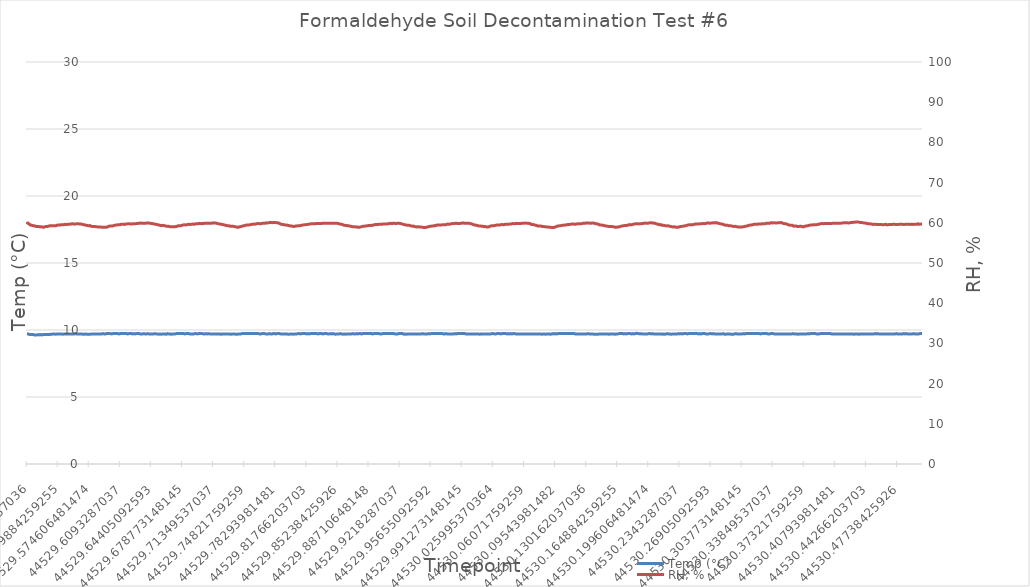
| Category | Temp (°C) |
|---|---|
| 44529.505162037036 | 9.731 |
| 44529.50585648148 | 9.706 |
| 44529.50655092592 | 9.706 |
| 44529.50724537037 | 9.682 |
| 44529.507939814815 | 9.657 |
| 44529.508634259255 | 9.657 |
| 44529.5093287037 | 9.657 |
| 44529.51002314815 | 9.657 |
| 44529.51071759259 | 9.657 |
| 44529.511412037034 | 9.657 |
| 44529.51210648148 | 9.657 |
| 44529.51280092592 | 9.657 |
| 44529.51349537037 | 9.632 |
| 44529.514189814814 | 9.657 |
| 44529.51488425925 | 9.632 |
| 44529.5155787037 | 9.657 |
| 44529.51627314815 | 9.632 |
| 44529.51696759259 | 9.657 |
| 44529.51766203703 | 9.657 |
| 44529.51835648148 | 9.657 |
| 44529.51905092593 | 9.632 |
| 44529.519745370366 | 9.632 |
| 44529.52043981481 | 9.657 |
| 44529.52113425926 | 9.632 |
| 44529.5218287037 | 9.632 |
| 44529.522523148145 | 9.682 |
| 44529.52321759259 | 9.657 |
| 44529.52391203703 | 9.657 |
| 44529.52460648148 | 9.657 |
| 44529.525300925925 | 9.657 |
| 44529.525995370364 | 9.657 |
| 44529.52668981481 | 9.682 |
| 44529.52738425926 | 9.657 |
| 44529.528078703705 | 9.657 |
| 44529.528773148144 | 9.657 |
| 44529.52946759259 | 9.682 |
| 44529.53016203704 | 9.657 |
| 44529.53085648148 | 9.682 |
| 44529.53155092592 | 9.682 |
| 44529.53224537037 | 9.682 |
| 44529.53293981481 | 9.682 |
| 44529.533634259256 | 9.706 |
| 44529.5343287037 | 9.706 |
| 44529.53502314814 | 9.706 |
| 44529.53571759259 | 9.706 |
| 44529.536412037036 | 9.682 |
| 44529.53710648148 | 9.682 |
| 44529.53780092592 | 9.682 |
| 44529.53849537037 | 9.706 |
| 44529.539189814815 | 9.706 |
| 44529.539884259255 | 9.706 |
| 44529.5405787037 | 9.706 |
| 44529.54127314815 | 9.706 |
| 44529.54196759259 | 9.706 |
| 44529.542662037034 | 9.706 |
| 44529.543356481474 | 9.706 |
| 44529.54405092592 | 9.706 |
| 44529.54474537037 | 9.706 |
| 44529.54543981481 | 9.682 |
| 44529.54613425925 | 9.706 |
| 44529.5468287037 | 9.706 |
| 44529.54752314815 | 9.706 |
| 44529.548217592586 | 9.706 |
| 44529.54891203703 | 9.706 |
| 44529.54960648148 | 9.706 |
| 44529.55030092592 | 9.706 |
| 44529.550995370366 | 9.706 |
| 44529.55168981481 | 9.706 |
| 44529.55238425925 | 9.706 |
| 44529.5530787037 | 9.682 |
| 44529.553773148145 | 9.706 |
| 44529.554467592585 | 9.706 |
| 44529.55516203703 | 9.706 |
| 44529.55585648148 | 9.706 |
| 44529.55655092592 | 9.706 |
| 44529.557245370364 | 9.706 |
| 44529.55793981481 | 9.706 |
| 44529.55863425926 | 9.706 |
| 44529.5593287037 | 9.731 |
| 44529.560023148144 | 9.706 |
| 44529.56071759259 | 9.706 |
| 44529.56141203703 | 9.706 |
| 44529.56210648148 | 9.706 |
| 44529.56280092592 | 9.706 |
| 44529.56349537036 | 9.706 |
| 44529.56418981481 | 9.706 |
| 44529.564884259256 | 9.706 |
| 44529.565578703696 | 9.706 |
| 44529.56627314814 | 9.706 |
| 44529.56696759259 | 9.706 |
| 44529.56766203703 | 9.682 |
| 44529.568356481475 | 9.706 |
| 44529.56905092592 | 9.682 |
| 44529.56974537037 | 9.682 |
| 44529.57043981481 | 9.706 |
| 44529.571134259255 | 9.682 |
| 44529.5718287037 | 9.682 |
| 44529.57252314814 | 9.682 |
| 44529.57321759259 | 9.682 |
| 44529.573912037034 | 9.682 |
| 44529.574606481474 | 9.682 |
| 44529.57530092592 | 9.706 |
| 44529.57599537037 | 9.682 |
| 44529.57668981481 | 9.682 |
| 44529.57738425925 | 9.706 |
| 44529.5780787037 | 9.706 |
| 44529.57877314815 | 9.706 |
| 44529.579467592586 | 9.682 |
| 44529.58016203703 | 9.706 |
| 44529.58085648148 | 9.706 |
| 44529.58155092592 | 9.706 |
| 44529.582245370366 | 9.706 |
| 44529.58293981481 | 9.706 |
| 44529.58363425926 | 9.706 |
| 44529.584328703706 | 9.706 |
| 44529.585023148145 | 9.706 |
| 44529.58571759259 | 9.706 |
| 44529.58641203704 | 9.706 |
| 44529.58710648148 | 9.706 |
| 44529.587800925925 | 9.682 |
| 44529.58849537037 | 9.706 |
| 44529.58918981482 | 9.731 |
| 44529.58988425926 | 9.731 |
| 44529.590578703705 | 9.706 |
| 44529.59127314815 | 9.706 |
| 44529.59196759259 | 9.731 |
| 44529.59266203704 | 9.706 |
| 44529.593356481484 | 9.731 |
| 44529.59405092592 | 9.731 |
| 44529.59474537037 | 9.731 |
| 44529.59543981482 | 9.731 |
| 44529.596134259256 | 9.731 |
| 44529.5968287037 | 9.731 |
| 44529.59752314815 | 9.731 |
| 44529.59821759259 | 9.731 |
| 44529.598912037036 | 9.706 |
| 44529.59960648148 | 9.706 |
| 44529.60030092593 | 9.706 |
| 44529.60099537037 | 9.731 |
| 44529.601689814815 | 9.706 |
| 44529.60238425926 | 9.731 |
| 44529.6030787037 | 9.731 |
| 44529.60377314815 | 9.731 |
| 44529.604467592595 | 9.731 |
| 44529.605162037034 | 9.731 |
| 44529.60585648148 | 9.731 |
| 44529.60655092593 | 9.731 |
| 44529.60724537037 | 9.731 |
| 44529.607939814814 | 9.706 |
| 44529.60863425926 | 9.731 |
| 44529.6093287037 | 9.731 |
| 44529.61002314815 | 9.706 |
| 44529.61071759259 | 9.731 |
| 44529.61141203704 | 9.731 |
| 44529.61210648148 | 9.731 |
| 44529.61280092593 | 9.731 |
| 44529.61349537037 | 9.731 |
| 44529.61418981481 | 9.731 |
| 44529.61488425926 | 9.731 |
| 44529.615578703706 | 9.731 |
| 44529.616273148145 | 9.731 |
| 44529.61696759259 | 9.706 |
| 44529.61766203704 | 9.706 |
| 44529.61835648148 | 9.731 |
| 44529.619050925925 | 9.731 |
| 44529.61974537037 | 9.731 |
| 44529.62043981482 | 9.731 |
| 44529.62113425926 | 9.731 |
| 44529.621828703705 | 9.731 |
| 44529.62252314815 | 9.706 |
| 44529.62321759259 | 9.706 |
| 44529.62391203704 | 9.731 |
| 44529.624606481484 | 9.731 |
| 44529.62530092592 | 9.706 |
| 44529.62599537037 | 9.706 |
| 44529.62668981481 | 9.706 |
| 44529.627384259256 | 9.731 |
| 44529.6280787037 | 9.731 |
| 44529.62877314814 | 9.731 |
| 44529.62946759259 | 9.731 |
| 44529.630162037036 | 9.731 |
| 44529.63085648148 | 9.731 |
| 44529.63155092592 | 9.706 |
| 44529.63224537037 | 9.731 |
| 44529.632939814815 | 9.706 |
| 44529.633634259255 | 9.706 |
| 44529.6343287037 | 9.706 |
| 44529.63502314815 | 9.706 |
| 44529.63571759259 | 9.731 |
| 44529.636412037034 | 9.731 |
| 44529.63710648148 | 9.706 |
| 44529.63780092592 | 9.706 |
| 44529.63849537037 | 9.706 |
| 44529.639189814814 | 9.706 |
| 44529.63988425925 | 9.731 |
| 44529.6405787037 | 9.706 |
| 44529.64127314815 | 9.706 |
| 44529.64196759259 | 9.706 |
| 44529.64266203703 | 9.706 |
| 44529.64335648148 | 9.706 |
| 44529.64405092593 | 9.706 |
| 44529.644745370366 | 9.706 |
| 44529.64543981481 | 9.706 |
| 44529.64613425926 | 9.706 |
| 44529.6468287037 | 9.706 |
| 44529.647523148145 | 9.706 |
| 44529.64821759259 | 9.731 |
| 44529.64891203703 | 9.706 |
| 44529.64960648148 | 9.706 |
| 44529.650300925925 | 9.706 |
| 44529.650995370364 | 9.706 |
| 44529.65168981481 | 9.706 |
| 44529.65238425926 | 9.682 |
| 44529.653078703705 | 9.706 |
| 44529.653773148144 | 9.706 |
| 44529.65446759259 | 9.682 |
| 44529.65516203704 | 9.682 |
| 44529.65585648148 | 9.682 |
| 44529.65655092592 | 9.706 |
| 44529.65724537037 | 9.706 |
| 44529.65793981481 | 9.706 |
| 44529.658634259256 | 9.706 |
| 44529.6593287037 | 9.706 |
| 44529.66002314814 | 9.706 |
| 44529.66071759259 | 9.682 |
| 44529.661412037036 | 9.706 |
| 44529.66210648148 | 9.731 |
| 44529.66280092592 | 9.706 |
| 44529.66349537037 | 9.706 |
| 44529.664189814815 | 9.706 |
| 44529.664884259255 | 9.706 |
| 44529.6655787037 | 9.706 |
| 44529.66627314815 | 9.682 |
| 44529.66696759259 | 9.706 |
| 44529.667662037034 | 9.706 |
| 44529.668356481474 | 9.706 |
| 44529.66905092592 | 9.706 |
| 44529.66974537037 | 9.706 |
| 44529.67043981481 | 9.706 |
| 44529.67113425925 | 9.731 |
| 44529.6718287037 | 9.731 |
| 44529.67252314815 | 9.731 |
| 44529.673217592586 | 9.731 |
| 44529.67391203703 | 9.731 |
| 44529.67460648148 | 9.731 |
| 44529.67530092592 | 9.731 |
| 44529.675995370366 | 9.731 |
| 44529.67668981481 | 9.706 |
| 44529.67738425925 | 9.731 |
| 44529.6780787037 | 9.731 |
| 44529.678773148145 | 9.731 |
| 44529.679467592585 | 9.706 |
| 44529.68016203703 | 9.731 |
| 44529.68085648148 | 9.731 |
| 44529.68155092592 | 9.706 |
| 44529.682245370364 | 9.706 |
| 44529.68293981481 | 9.731 |
| 44529.68363425926 | 9.731 |
| 44529.6843287037 | 9.731 |
| 44529.685023148144 | 9.731 |
| 44529.68571759259 | 9.731 |
| 44529.68641203703 | 9.731 |
| 44529.68710648148 | 9.706 |
| 44529.68780092592 | 9.731 |
| 44529.68849537036 | 9.706 |
| 44529.68918981481 | 9.731 |
| 44529.689884259256 | 9.706 |
| 44529.690578703696 | 9.731 |
| 44529.69127314814 | 9.706 |
| 44529.69196759259 | 9.731 |
| 44529.69266203703 | 9.731 |
| 44529.693356481475 | 9.731 |
| 44529.69405092592 | 9.731 |
| 44529.69474537037 | 9.731 |
| 44529.69543981481 | 9.706 |
| 44529.696134259255 | 9.706 |
| 44529.6968287037 | 9.731 |
| 44529.69752314814 | 9.731 |
| 44529.69821759259 | 9.731 |
| 44529.698912037034 | 9.731 |
| 44529.699606481474 | 9.731 |
| 44529.70030092592 | 9.706 |
| 44529.70099537037 | 9.731 |
| 44529.70168981481 | 9.706 |
| 44529.70238425925 | 9.706 |
| 44529.7030787037 | 9.731 |
| 44529.70377314815 | 9.706 |
| 44529.704467592586 | 9.731 |
| 44529.70516203703 | 9.731 |
| 44529.70585648148 | 9.706 |
| 44529.70655092592 | 9.706 |
| 44529.707245370366 | 9.731 |
| 44529.70793981481 | 9.731 |
| 44529.70863425926 | 9.706 |
| 44529.709328703706 | 9.706 |
| 44529.710023148145 | 9.731 |
| 44529.71071759259 | 9.706 |
| 44529.71141203704 | 9.706 |
| 44529.71210648148 | 9.706 |
| 44529.712800925925 | 9.731 |
| 44529.71349537037 | 9.706 |
| 44529.71418981482 | 9.706 |
| 44529.71488425926 | 9.706 |
| 44529.715578703705 | 9.706 |
| 44529.71627314815 | 9.706 |
| 44529.71696759259 | 9.706 |
| 44529.71766203704 | 9.706 |
| 44529.718356481484 | 9.706 |
| 44529.71905092592 | 9.706 |
| 44529.71974537037 | 9.706 |
| 44529.72043981482 | 9.706 |
| 44529.721134259256 | 9.682 |
| 44529.7218287037 | 9.682 |
| 44529.72252314815 | 9.706 |
| 44529.72321759259 | 9.706 |
| 44529.723912037036 | 9.706 |
| 44529.72460648148 | 9.706 |
| 44529.72530092593 | 9.706 |
| 44529.72599537037 | 9.706 |
| 44529.726689814815 | 9.706 |
| 44529.72738425926 | 9.706 |
| 44529.7280787037 | 9.706 |
| 44529.72877314815 | 9.706 |
| 44529.729467592595 | 9.682 |
| 44529.730162037034 | 9.706 |
| 44529.73085648148 | 9.682 |
| 44529.73155092593 | 9.706 |
| 44529.73224537037 | 9.682 |
| 44529.732939814814 | 9.682 |
| 44529.73363425926 | 9.706 |
| 44529.7343287037 | 9.706 |
| 44529.73502314815 | 9.706 |
| 44529.73571759259 | 9.706 |
| 44529.73641203704 | 9.706 |
| 44529.73710648148 | 9.706 |
| 44529.73780092593 | 9.706 |
| 44529.73849537037 | 9.682 |
| 44529.73918981481 | 9.706 |
| 44529.73988425926 | 9.682 |
| 44529.740578703706 | 9.682 |
| 44529.741273148145 | 9.706 |
| 44529.74196759259 | 9.706 |
| 44529.74266203704 | 9.706 |
| 44529.74335648148 | 9.731 |
| 44529.744050925925 | 9.706 |
| 44529.74474537037 | 9.706 |
| 44529.74543981482 | 9.731 |
| 44529.74613425926 | 9.731 |
| 44529.746828703705 | 9.731 |
| 44529.74752314815 | 9.731 |
| 44529.74821759259 | 9.731 |
| 44529.74891203704 | 9.731 |
| 44529.749606481484 | 9.731 |
| 44529.75030092592 | 9.731 |
| 44529.75099537037 | 9.731 |
| 44529.75168981481 | 9.731 |
| 44529.752384259256 | 9.731 |
| 44529.7530787037 | 9.731 |
| 44529.75377314814 | 9.731 |
| 44529.75446759259 | 9.731 |
| 44529.755162037036 | 9.731 |
| 44529.75585648148 | 9.731 |
| 44529.75655092592 | 9.731 |
| 44529.75724537037 | 9.731 |
| 44529.757939814815 | 9.731 |
| 44529.758634259255 | 9.731 |
| 44529.7593287037 | 9.731 |
| 44529.76002314815 | 9.731 |
| 44529.76071759259 | 9.731 |
| 44529.761412037034 | 9.706 |
| 44529.76210648148 | 9.731 |
| 44529.76280092592 | 9.731 |
| 44529.76349537037 | 9.731 |
| 44529.764189814814 | 9.731 |
| 44529.76488425925 | 9.706 |
| 44529.7655787037 | 9.706 |
| 44529.76627314815 | 9.706 |
| 44529.76696759259 | 9.731 |
| 44529.76766203703 | 9.731 |
| 44529.76835648148 | 9.731 |
| 44529.76905092593 | 9.731 |
| 44529.769745370366 | 9.731 |
| 44529.77043981481 | 9.731 |
| 44529.77113425926 | 9.731 |
| 44529.7718287037 | 9.706 |
| 44529.772523148145 | 9.706 |
| 44529.77321759259 | 9.706 |
| 44529.77391203703 | 9.706 |
| 44529.77460648148 | 9.706 |
| 44529.775300925925 | 9.731 |
| 44529.775995370364 | 9.731 |
| 44529.77668981481 | 9.731 |
| 44529.77738425926 | 9.706 |
| 44529.778078703705 | 9.731 |
| 44529.778773148144 | 9.706 |
| 44529.77946759259 | 9.731 |
| 44529.78016203704 | 9.731 |
| 44529.78085648148 | 9.706 |
| 44529.78155092592 | 9.731 |
| 44529.78224537037 | 9.731 |
| 44529.78293981481 | 9.706 |
| 44529.783634259256 | 9.731 |
| 44529.7843287037 | 9.731 |
| 44529.78502314814 | 9.731 |
| 44529.78571759259 | 9.731 |
| 44529.786412037036 | 9.706 |
| 44529.78710648148 | 9.731 |
| 44529.78780092592 | 9.706 |
| 44529.78849537037 | 9.706 |
| 44529.789189814815 | 9.706 |
| 44529.789884259255 | 9.706 |
| 44529.7905787037 | 9.706 |
| 44529.79127314815 | 9.706 |
| 44529.79196759259 | 9.706 |
| 44529.792662037034 | 9.706 |
| 44529.793356481474 | 9.706 |
| 44529.79405092592 | 9.706 |
| 44529.79474537037 | 9.682 |
| 44529.79543981481 | 9.706 |
| 44529.79613425925 | 9.682 |
| 44529.7968287037 | 9.682 |
| 44529.79752314815 | 9.706 |
| 44529.798217592586 | 9.682 |
| 44529.79891203703 | 9.706 |
| 44529.79960648148 | 9.706 |
| 44529.80030092592 | 9.706 |
| 44529.800995370366 | 9.706 |
| 44529.80168981481 | 9.682 |
| 44529.80238425925 | 9.682 |
| 44529.8030787037 | 9.682 |
| 44529.803773148145 | 9.706 |
| 44529.804467592585 | 9.706 |
| 44529.80516203703 | 9.706 |
| 44529.80585648148 | 9.706 |
| 44529.80655092592 | 9.706 |
| 44529.807245370364 | 9.706 |
| 44529.80793981481 | 9.731 |
| 44529.80863425926 | 9.706 |
| 44529.8093287037 | 9.731 |
| 44529.810023148144 | 9.706 |
| 44529.81071759259 | 9.706 |
| 44529.81141203703 | 9.731 |
| 44529.81210648148 | 9.731 |
| 44529.81280092592 | 9.731 |
| 44529.81349537036 | 9.731 |
| 44529.81418981481 | 9.706 |
| 44529.814884259256 | 9.731 |
| 44529.815578703696 | 9.731 |
| 44529.81627314814 | 9.731 |
| 44529.81696759259 | 9.706 |
| 44529.81766203703 | 9.706 |
| 44529.818356481475 | 9.731 |
| 44529.81905092592 | 9.731 |
| 44529.81974537037 | 9.731 |
| 44529.82043981481 | 9.706 |
| 44529.821134259255 | 9.731 |
| 44529.8218287037 | 9.731 |
| 44529.82252314814 | 9.706 |
| 44529.82321759259 | 9.731 |
| 44529.823912037034 | 9.731 |
| 44529.824606481474 | 9.731 |
| 44529.82530092592 | 9.731 |
| 44529.82599537037 | 9.731 |
| 44529.82668981481 | 9.731 |
| 44529.82738425925 | 9.731 |
| 44529.8280787037 | 9.731 |
| 44529.82877314815 | 9.731 |
| 44529.829467592586 | 9.731 |
| 44529.83016203703 | 9.706 |
| 44529.83085648148 | 9.731 |
| 44529.83155092592 | 9.731 |
| 44529.832245370366 | 9.731 |
| 44529.83293981481 | 9.731 |
| 44529.83363425926 | 9.731 |
| 44529.834328703706 | 9.731 |
| 44529.835023148145 | 9.731 |
| 44529.83571759259 | 9.706 |
| 44529.83641203704 | 9.731 |
| 44529.83710648148 | 9.731 |
| 44529.837800925925 | 9.731 |
| 44529.83849537037 | 9.731 |
| 44529.83918981482 | 9.706 |
| 44529.83988425926 | 9.731 |
| 44529.840578703705 | 9.731 |
| 44529.84127314815 | 9.706 |
| 44529.84196759259 | 9.706 |
| 44529.84266203704 | 9.706 |
| 44529.843356481484 | 9.731 |
| 44529.84405092592 | 9.731 |
| 44529.84474537037 | 9.706 |
| 44529.84543981482 | 9.706 |
| 44529.846134259256 | 9.706 |
| 44529.8468287037 | 9.731 |
| 44529.84752314815 | 9.706 |
| 44529.84821759259 | 9.706 |
| 44529.848912037036 | 9.706 |
| 44529.84960648148 | 9.682 |
| 44529.85030092593 | 9.706 |
| 44529.85099537037 | 9.706 |
| 44529.851689814815 | 9.706 |
| 44529.85238425926 | 9.706 |
| 44529.8530787037 | 9.706 |
| 44529.85377314815 | 9.706 |
| 44529.854467592595 | 9.706 |
| 44529.855162037034 | 9.731 |
| 44529.85585648148 | 9.706 |
| 44529.85655092593 | 9.706 |
| 44529.85724537037 | 9.706 |
| 44529.857939814814 | 9.682 |
| 44529.85863425926 | 9.682 |
| 44529.8593287037 | 9.706 |
| 44529.86002314815 | 9.682 |
| 44529.86071759259 | 9.682 |
| 44529.86141203704 | 9.706 |
| 44529.86210648148 | 9.706 |
| 44529.86280092593 | 9.731 |
| 44529.86349537037 | 9.706 |
| 44529.86418981481 | 9.706 |
| 44529.86488425926 | 9.706 |
| 44529.865578703706 | 9.706 |
| 44529.866273148145 | 9.706 |
| 44529.86696759259 | 9.731 |
| 44529.86766203704 | 9.706 |
| 44529.86835648148 | 9.706 |
| 44529.869050925925 | 9.731 |
| 44529.86974537037 | 9.706 |
| 44529.87043981482 | 9.706 |
| 44529.87113425926 | 9.706 |
| 44529.871828703705 | 9.706 |
| 44529.87252314815 | 9.706 |
| 44529.87321759259 | 9.731 |
| 44529.87391203704 | 9.706 |
| 44529.874606481484 | 9.706 |
| 44529.87530092592 | 9.706 |
| 44529.87599537037 | 9.731 |
| 44529.87668981481 | 9.706 |
| 44529.877384259256 | 9.731 |
| 44529.8780787037 | 9.731 |
| 44529.87877314814 | 9.706 |
| 44529.87946759259 | 9.731 |
| 44529.880162037036 | 9.731 |
| 44529.88085648148 | 9.731 |
| 44529.88155092592 | 9.731 |
| 44529.88224537037 | 9.731 |
| 44529.882939814815 | 9.731 |
| 44529.883634259255 | 9.731 |
| 44529.8843287037 | 9.731 |
| 44529.88502314815 | 9.756 |
| 44529.88571759259 | 9.731 |
| 44529.886412037034 | 9.731 |
| 44529.88710648148 | 9.731 |
| 44529.88780092592 | 9.731 |
| 44529.88849537037 | 9.731 |
| 44529.889189814814 | 9.706 |
| 44529.88988425925 | 9.731 |
| 44529.8905787037 | 9.731 |
| 44529.89127314815 | 9.706 |
| 44529.89196759259 | 9.706 |
| 44529.89266203703 | 9.731 |
| 44529.89335648148 | 9.731 |
| 44529.89405092593 | 9.731 |
| 44529.894745370366 | 9.731 |
| 44529.89543981481 | 9.731 |
| 44529.89613425926 | 9.731 |
| 44529.8968287037 | 9.731 |
| 44529.897523148145 | 9.706 |
| 44529.89821759259 | 9.731 |
| 44529.89891203703 | 9.731 |
| 44529.89960648148 | 9.706 |
| 44529.900300925925 | 9.731 |
| 44529.900995370364 | 9.706 |
| 44529.90168981481 | 9.731 |
| 44529.90238425926 | 9.731 |
| 44529.903078703705 | 9.756 |
| 44529.903773148144 | 9.731 |
| 44529.90446759259 | 9.731 |
| 44529.90516203704 | 9.731 |
| 44529.90585648148 | 9.731 |
| 44529.90655092592 | 9.731 |
| 44529.90724537037 | 9.731 |
| 44529.90793981481 | 9.731 |
| 44529.908634259256 | 9.731 |
| 44529.9093287037 | 9.731 |
| 44529.91002314814 | 9.706 |
| 44529.91071759259 | 9.731 |
| 44529.911412037036 | 9.731 |
| 44529.91210648148 | 9.731 |
| 44529.91280092592 | 9.731 |
| 44529.91349537037 | 9.731 |
| 44529.914189814815 | 9.731 |
| 44529.914884259255 | 9.731 |
| 44529.9155787037 | 9.731 |
| 44529.91627314815 | 9.706 |
| 44529.91696759259 | 9.706 |
| 44529.917662037034 | 9.706 |
| 44529.918356481474 | 9.706 |
| 44529.91905092592 | 9.706 |
| 44529.91974537037 | 9.706 |
| 44529.92043981481 | 9.731 |
| 44529.92113425925 | 9.731 |
| 44529.9218287037 | 9.731 |
| 44529.92252314815 | 9.706 |
| 44529.923217592586 | 9.731 |
| 44529.92391203703 | 9.706 |
| 44529.92460648148 | 9.731 |
| 44529.92530092592 | 9.706 |
| 44529.925995370366 | 9.682 |
| 44529.92668981481 | 9.706 |
| 44529.92738425925 | 9.706 |
| 44529.9280787037 | 9.682 |
| 44529.928773148145 | 9.682 |
| 44529.929467592585 | 9.706 |
| 44529.93016203703 | 9.706 |
| 44529.93085648148 | 9.706 |
| 44529.93155092592 | 9.706 |
| 44529.932245370364 | 9.706 |
| 44529.93293981481 | 9.706 |
| 44529.93363425926 | 9.706 |
| 44529.9343287037 | 9.706 |
| 44529.935023148144 | 9.731 |
| 44529.93571759259 | 9.706 |
| 44529.93641203703 | 9.706 |
| 44529.93710648148 | 9.706 |
| 44529.93780092592 | 9.706 |
| 44529.93849537036 | 9.706 |
| 44529.93918981481 | 9.706 |
| 44529.939884259256 | 9.706 |
| 44529.940578703696 | 9.706 |
| 44529.94127314814 | 9.706 |
| 44529.94196759259 | 9.682 |
| 44529.94266203703 | 9.706 |
| 44529.943356481475 | 9.706 |
| 44529.94405092592 | 9.706 |
| 44529.94474537037 | 9.706 |
| 44529.94543981481 | 9.706 |
| 44529.946134259255 | 9.706 |
| 44529.9468287037 | 9.731 |
| 44529.94752314814 | 9.706 |
| 44529.94821759259 | 9.706 |
| 44529.948912037034 | 9.731 |
| 44529.949606481474 | 9.706 |
| 44529.95030092592 | 9.731 |
| 44529.95099537037 | 9.706 |
| 44529.95168981481 | 9.706 |
| 44529.95238425925 | 9.706 |
| 44529.9530787037 | 9.731 |
| 44529.95377314815 | 9.731 |
| 44529.954467592586 | 9.706 |
| 44529.95516203703 | 9.706 |
| 44529.95585648148 | 9.731 |
| 44529.95655092592 | 9.731 |
| 44529.957245370366 | 9.731 |
| 44529.95793981481 | 9.731 |
| 44529.95863425926 | 9.731 |
| 44529.959328703706 | 9.731 |
| 44529.960023148145 | 9.731 |
| 44529.96071759259 | 9.731 |
| 44529.96141203704 | 9.731 |
| 44529.96210648148 | 9.731 |
| 44529.962800925925 | 9.731 |
| 44529.96349537037 | 9.731 |
| 44529.96418981482 | 9.731 |
| 44529.96488425926 | 9.731 |
| 44529.965578703705 | 9.731 |
| 44529.96627314815 | 9.731 |
| 44529.96696759259 | 9.731 |
| 44529.96766203704 | 9.731 |
| 44529.968356481484 | 9.731 |
| 44529.96905092592 | 9.731 |
| 44529.96974537037 | 9.731 |
| 44529.97043981482 | 9.706 |
| 44529.971134259256 | 9.731 |
| 44529.9718287037 | 9.706 |
| 44529.97252314815 | 9.731 |
| 44529.97321759259 | 9.731 |
| 44529.973912037036 | 9.731 |
| 44529.97460648148 | 9.706 |
| 44529.97530092593 | 9.731 |
| 44529.97599537037 | 9.706 |
| 44529.976689814815 | 9.731 |
| 44529.97738425926 | 9.706 |
| 44529.9780787037 | 9.706 |
| 44529.97877314815 | 9.706 |
| 44529.979467592595 | 9.731 |
| 44529.980162037034 | 9.706 |
| 44529.98085648148 | 9.731 |
| 44529.98155092593 | 9.706 |
| 44529.98224537037 | 9.731 |
| 44529.982939814814 | 9.731 |
| 44529.98363425926 | 9.706 |
| 44529.9843287037 | 9.706 |
| 44529.98502314815 | 9.731 |
| 44529.98571759259 | 9.731 |
| 44529.98641203704 | 9.731 |
| 44529.98710648148 | 9.731 |
| 44529.98780092593 | 9.731 |
| 44529.98849537037 | 9.731 |
| 44529.98918981481 | 9.731 |
| 44529.98988425926 | 9.731 |
| 44529.990578703706 | 9.706 |
| 44529.991273148145 | 9.731 |
| 44529.99196759259 | 9.731 |
| 44529.99266203704 | 9.731 |
| 44529.99335648148 | 9.731 |
| 44529.994050925925 | 9.731 |
| 44529.99474537037 | 9.731 |
| 44529.99543981482 | 9.706 |
| 44529.99613425926 | 9.706 |
| 44529.996828703705 | 9.706 |
| 44529.99752314815 | 9.706 |
| 44529.99821759259 | 9.706 |
| 44529.99891203704 | 9.706 |
| 44529.999606481484 | 9.706 |
| 44530.00030092592 | 9.706 |
| 44530.00099537037 | 9.706 |
| 44530.00168981481 | 9.706 |
| 44530.002384259256 | 9.706 |
| 44530.0030787037 | 9.706 |
| 44530.00377314814 | 9.706 |
| 44530.00446759259 | 9.706 |
| 44530.005162037036 | 9.706 |
| 44530.00585648148 | 9.706 |
| 44530.00655092592 | 9.706 |
| 44530.00724537037 | 9.706 |
| 44530.007939814815 | 9.706 |
| 44530.008634259255 | 9.706 |
| 44530.0093287037 | 9.706 |
| 44530.01002314815 | 9.706 |
| 44530.01071759259 | 9.682 |
| 44530.011412037034 | 9.706 |
| 44530.01210648148 | 9.706 |
| 44530.01280092592 | 9.706 |
| 44530.01349537037 | 9.706 |
| 44530.014189814814 | 9.706 |
| 44530.01488425925 | 9.706 |
| 44530.0155787037 | 9.731 |
| 44530.01627314815 | 9.706 |
| 44530.01696759259 | 9.706 |
| 44530.01766203703 | 9.706 |
| 44530.01835648148 | 9.731 |
| 44530.01905092593 | 9.706 |
| 44530.019745370366 | 9.706 |
| 44530.02043981481 | 9.706 |
| 44530.02113425926 | 9.731 |
| 44530.0218287037 | 9.706 |
| 44530.022523148145 | 9.706 |
| 44530.02321759259 | 9.706 |
| 44530.02391203703 | 9.706 |
| 44530.02460648148 | 9.731 |
| 44530.025300925925 | 9.731 |
| 44530.025995370364 | 9.731 |
| 44530.02668981481 | 9.731 |
| 44530.02738425926 | 9.706 |
| 44530.028078703705 | 9.731 |
| 44530.028773148144 | 9.706 |
| 44530.02946759259 | 9.706 |
| 44530.03016203704 | 9.731 |
| 44530.03085648148 | 9.706 |
| 44530.03155092592 | 9.731 |
| 44530.03224537037 | 9.731 |
| 44530.03293981481 | 9.731 |
| 44530.033634259256 | 9.731 |
| 44530.0343287037 | 9.706 |
| 44530.03502314814 | 9.731 |
| 44530.03571759259 | 9.731 |
| 44530.036412037036 | 9.731 |
| 44530.03710648148 | 9.731 |
| 44530.03780092592 | 9.731 |
| 44530.03849537037 | 9.731 |
| 44530.039189814815 | 9.731 |
| 44530.039884259255 | 9.731 |
| 44530.0405787037 | 9.731 |
| 44530.04127314815 | 9.706 |
| 44530.04196759259 | 9.731 |
| 44530.042662037034 | 9.731 |
| 44530.043356481474 | 9.731 |
| 44530.04405092592 | 9.706 |
| 44530.04474537037 | 9.731 |
| 44530.04543981481 | 9.731 |
| 44530.04613425925 | 9.706 |
| 44530.0468287037 | 9.706 |
| 44530.04752314815 | 9.731 |
| 44530.048217592586 | 9.731 |
| 44530.04891203703 | 9.731 |
| 44530.04960648148 | 9.731 |
| 44530.05030092592 | 9.706 |
| 44530.050995370366 | 9.706 |
| 44530.05168981481 | 9.706 |
| 44530.05238425925 | 9.706 |
| 44530.0530787037 | 9.706 |
| 44530.053773148145 | 9.706 |
| 44530.054467592585 | 9.706 |
| 44530.05516203703 | 9.706 |
| 44530.05585648148 | 9.682 |
| 44530.05655092592 | 9.706 |
| 44530.057245370364 | 9.706 |
| 44530.05793981481 | 9.706 |
| 44530.05863425926 | 9.706 |
| 44530.0593287037 | 9.706 |
| 44530.060023148144 | 9.706 |
| 44530.06071759259 | 9.706 |
| 44530.06141203703 | 9.706 |
| 44530.06210648148 | 9.706 |
| 44530.06280092592 | 9.706 |
| 44530.06349537036 | 9.706 |
| 44530.06418981481 | 9.706 |
| 44530.064884259256 | 9.706 |
| 44530.065578703696 | 9.706 |
| 44530.06627314814 | 9.706 |
| 44530.06696759259 | 9.731 |
| 44530.06766203703 | 9.706 |
| 44530.068356481475 | 9.706 |
| 44530.06905092592 | 9.706 |
| 44530.06974537037 | 9.706 |
| 44530.07043981481 | 9.706 |
| 44530.071134259255 | 9.706 |
| 44530.0718287037 | 9.706 |
| 44530.07252314814 | 9.706 |
| 44530.07321759259 | 9.706 |
| 44530.073912037034 | 9.731 |
| 44530.074606481474 | 9.706 |
| 44530.07530092592 | 9.706 |
| 44530.07599537037 | 9.706 |
| 44530.07668981481 | 9.682 |
| 44530.07738425925 | 9.706 |
| 44530.0780787037 | 9.706 |
| 44530.07877314815 | 9.706 |
| 44530.079467592586 | 9.682 |
| 44530.08016203703 | 9.682 |
| 44530.08085648148 | 9.706 |
| 44530.08155092592 | 9.706 |
| 44530.082245370366 | 9.706 |
| 44530.08293981481 | 9.706 |
| 44530.08363425926 | 9.706 |
| 44530.084328703706 | 9.682 |
| 44530.085023148145 | 9.706 |
| 44530.08571759259 | 9.706 |
| 44530.08641203704 | 9.682 |
| 44530.08710648148 | 9.706 |
| 44530.087800925925 | 9.706 |
| 44530.08849537037 | 9.706 |
| 44530.08918981482 | 9.706 |
| 44530.08988425926 | 9.682 |
| 44530.090578703705 | 9.706 |
| 44530.09127314815 | 9.706 |
| 44530.09196759259 | 9.731 |
| 44530.09266203704 | 9.731 |
| 44530.093356481484 | 9.706 |
| 44530.09405092592 | 9.706 |
| 44530.09474537037 | 9.731 |
| 44530.09543981482 | 9.731 |
| 44530.096134259256 | 9.731 |
| 44530.0968287037 | 9.706 |
| 44530.09752314815 | 9.731 |
| 44530.09821759259 | 9.731 |
| 44530.098912037036 | 9.731 |
| 44530.09960648148 | 9.731 |
| 44530.10030092593 | 9.731 |
| 44530.10099537037 | 9.731 |
| 44530.101689814815 | 9.731 |
| 44530.10238425926 | 9.731 |
| 44530.1030787037 | 9.731 |
| 44530.10377314815 | 9.731 |
| 44530.104467592595 | 9.706 |
| 44530.105162037034 | 9.731 |
| 44530.10585648148 | 9.731 |
| 44530.10655092593 | 9.731 |
| 44530.10724537037 | 9.731 |
| 44530.107939814814 | 9.731 |
| 44530.10863425926 | 9.731 |
| 44530.1093287037 | 9.731 |
| 44530.11002314815 | 9.731 |
| 44530.11071759259 | 9.731 |
| 44530.11141203704 | 9.731 |
| 44530.11210648148 | 9.731 |
| 44530.11280092593 | 9.756 |
| 44530.11349537037 | 9.731 |
| 44530.11418981481 | 9.731 |
| 44530.11488425926 | 9.731 |
| 44530.115578703706 | 9.731 |
| 44530.116273148145 | 9.731 |
| 44530.11696759259 | 9.731 |
| 44530.11766203704 | 9.706 |
| 44530.11835648148 | 9.706 |
| 44530.119050925925 | 9.706 |
| 44530.11974537037 | 9.706 |
| 44530.12043981482 | 9.706 |
| 44530.12113425926 | 9.706 |
| 44530.121828703705 | 9.706 |
| 44530.12252314815 | 9.706 |
| 44530.12321759259 | 9.706 |
| 44530.12391203704 | 9.731 |
| 44530.124606481484 | 9.706 |
| 44530.12530092592 | 9.706 |
| 44530.12599537037 | 9.706 |
| 44530.12668981481 | 9.706 |
| 44530.127384259256 | 9.706 |
| 44530.1280787037 | 9.706 |
| 44530.12877314814 | 9.706 |
| 44530.12946759259 | 9.706 |
| 44530.130162037036 | 9.706 |
| 44530.13085648148 | 9.706 |
| 44530.13155092592 | 9.731 |
| 44530.13224537037 | 9.731 |
| 44530.132939814815 | 9.706 |
| 44530.133634259255 | 9.731 |
| 44530.1343287037 | 9.706 |
| 44530.13502314815 | 9.706 |
| 44530.13571759259 | 9.706 |
| 44530.136412037034 | 9.706 |
| 44530.13710648148 | 9.706 |
| 44530.13780092592 | 9.706 |
| 44530.13849537037 | 9.682 |
| 44530.139189814814 | 9.706 |
| 44530.13988425925 | 9.682 |
| 44530.1405787037 | 9.706 |
| 44530.14127314815 | 9.682 |
| 44530.14196759259 | 9.706 |
| 44530.14266203703 | 9.682 |
| 44530.14335648148 | 9.706 |
| 44530.14405092593 | 9.706 |
| 44530.144745370366 | 9.682 |
| 44530.14543981481 | 9.706 |
| 44530.14613425926 | 9.706 |
| 44530.1468287037 | 9.706 |
| 44530.147523148145 | 9.706 |
| 44530.14821759259 | 9.706 |
| 44530.14891203703 | 9.706 |
| 44530.14960648148 | 9.706 |
| 44530.150300925925 | 9.706 |
| 44530.150995370364 | 9.706 |
| 44530.15168981481 | 9.706 |
| 44530.15238425926 | 9.706 |
| 44530.153078703705 | 9.706 |
| 44530.153773148144 | 9.706 |
| 44530.15446759259 | 9.706 |
| 44530.15516203704 | 9.682 |
| 44530.15585648148 | 9.682 |
| 44530.15655092592 | 9.706 |
| 44530.15724537037 | 9.706 |
| 44530.15793981481 | 9.706 |
| 44530.158634259256 | 9.706 |
| 44530.1593287037 | 9.706 |
| 44530.16002314814 | 9.706 |
| 44530.16071759259 | 9.706 |
| 44530.161412037036 | 9.706 |
| 44530.16210648148 | 9.682 |
| 44530.16280092592 | 9.706 |
| 44530.16349537037 | 9.706 |
| 44530.164189814815 | 9.706 |
| 44530.164884259255 | 9.706 |
| 44530.1655787037 | 9.706 |
| 44530.16627314815 | 9.731 |
| 44530.16696759259 | 9.706 |
| 44530.167662037034 | 9.731 |
| 44530.168356481474 | 9.706 |
| 44530.16905092592 | 9.731 |
| 44530.16974537037 | 9.731 |
| 44530.17043981481 | 9.731 |
| 44530.17113425925 | 9.731 |
| 44530.1718287037 | 9.706 |
| 44530.17252314815 | 9.706 |
| 44530.173217592586 | 9.731 |
| 44530.17391203703 | 9.706 |
| 44530.17460648148 | 9.706 |
| 44530.17530092592 | 9.706 |
| 44530.175995370366 | 9.731 |
| 44530.17668981481 | 9.706 |
| 44530.17738425925 | 9.731 |
| 44530.1780787037 | 9.731 |
| 44530.178773148145 | 9.731 |
| 44530.179467592585 | 9.731 |
| 44530.18016203703 | 9.706 |
| 44530.18085648148 | 9.706 |
| 44530.18155092592 | 9.731 |
| 44530.182245370364 | 9.731 |
| 44530.18293981481 | 9.706 |
| 44530.18363425926 | 9.731 |
| 44530.1843287037 | 9.731 |
| 44530.185023148144 | 9.756 |
| 44530.18571759259 | 9.756 |
| 44530.18641203703 | 9.731 |
| 44530.18710648148 | 9.731 |
| 44530.18780092592 | 9.731 |
| 44530.18849537036 | 9.731 |
| 44530.18918981481 | 9.706 |
| 44530.189884259256 | 9.706 |
| 44530.190578703696 | 9.731 |
| 44530.19127314814 | 9.731 |
| 44530.19196759259 | 9.731 |
| 44530.19266203703 | 9.706 |
| 44530.193356481475 | 9.706 |
| 44530.19405092592 | 9.706 |
| 44530.19474537037 | 9.706 |
| 44530.19543981481 | 9.706 |
| 44530.196134259255 | 9.706 |
| 44530.1968287037 | 9.706 |
| 44530.19752314814 | 9.731 |
| 44530.19821759259 | 9.706 |
| 44530.198912037034 | 9.706 |
| 44530.199606481474 | 9.731 |
| 44530.20030092592 | 9.706 |
| 44530.20099537037 | 9.731 |
| 44530.20168981481 | 9.706 |
| 44530.20238425925 | 9.706 |
| 44530.2030787037 | 9.706 |
| 44530.20377314815 | 9.731 |
| 44530.204467592586 | 9.706 |
| 44530.20516203703 | 9.706 |
| 44530.20585648148 | 9.706 |
| 44530.20655092592 | 9.706 |
| 44530.207245370366 | 9.706 |
| 44530.20793981481 | 9.706 |
| 44530.20863425926 | 9.706 |
| 44530.209328703706 | 9.706 |
| 44530.210023148145 | 9.706 |
| 44530.21071759259 | 9.706 |
| 44530.21141203704 | 9.706 |
| 44530.21210648148 | 9.706 |
| 44530.212800925925 | 9.706 |
| 44530.21349537037 | 9.706 |
| 44530.21418981482 | 9.682 |
| 44530.21488425926 | 9.682 |
| 44530.215578703705 | 9.682 |
| 44530.21627314815 | 9.706 |
| 44530.21696759259 | 9.706 |
| 44530.21766203704 | 9.682 |
| 44530.218356481484 | 9.706 |
| 44530.21905092592 | 9.706 |
| 44530.21974537037 | 9.706 |
| 44530.22043981482 | 9.731 |
| 44530.221134259256 | 9.706 |
| 44530.2218287037 | 9.706 |
| 44530.22252314815 | 9.706 |
| 44530.22321759259 | 9.706 |
| 44530.223912037036 | 9.706 |
| 44530.22460648148 | 9.682 |
| 44530.22530092593 | 9.706 |
| 44530.22599537037 | 9.706 |
| 44530.226689814815 | 9.706 |
| 44530.22738425926 | 9.706 |
| 44530.2280787037 | 9.682 |
| 44530.22877314815 | 9.706 |
| 44530.229467592595 | 9.706 |
| 44530.230162037034 | 9.706 |
| 44530.23085648148 | 9.706 |
| 44530.23155092593 | 9.706 |
| 44530.23224537037 | 9.706 |
| 44530.232939814814 | 9.731 |
| 44530.23363425926 | 9.706 |
| 44530.2343287037 | 9.706 |
| 44530.23502314815 | 9.706 |
| 44530.23571759259 | 9.731 |
| 44530.23641203704 | 9.731 |
| 44530.23710648148 | 9.706 |
| 44530.23780092593 | 9.706 |
| 44530.23849537037 | 9.731 |
| 44530.23918981481 | 9.731 |
| 44530.23988425926 | 9.731 |
| 44530.240578703706 | 9.731 |
| 44530.241273148145 | 9.731 |
| 44530.24196759259 | 9.706 |
| 44530.24266203704 | 9.706 |
| 44530.24335648148 | 9.731 |
| 44530.244050925925 | 9.731 |
| 44530.24474537037 | 9.731 |
| 44530.24543981482 | 9.731 |
| 44530.24613425926 | 9.731 |
| 44530.246828703705 | 9.731 |
| 44530.24752314815 | 9.731 |
| 44530.24821759259 | 9.731 |
| 44530.24891203704 | 9.731 |
| 44530.249606481484 | 9.731 |
| 44530.25030092592 | 9.756 |
| 44530.25099537037 | 9.731 |
| 44530.25168981481 | 9.731 |
| 44530.252384259256 | 9.756 |
| 44530.2530787037 | 9.731 |
| 44530.25377314814 | 9.731 |
| 44530.25446759259 | 9.731 |
| 44530.255162037036 | 9.706 |
| 44530.25585648148 | 9.706 |
| 44530.25655092592 | 9.731 |
| 44530.25724537037 | 9.731 |
| 44530.257939814815 | 9.706 |
| 44530.258634259255 | 9.731 |
| 44530.2593287037 | 9.731 |
| 44530.26002314815 | 9.706 |
| 44530.26071759259 | 9.731 |
| 44530.261412037034 | 9.706 |
| 44530.26210648148 | 9.731 |
| 44530.26280092592 | 9.706 |
| 44530.26349537037 | 9.706 |
| 44530.264189814814 | 9.731 |
| 44530.26488425925 | 9.706 |
| 44530.2655787037 | 9.706 |
| 44530.26627314815 | 9.706 |
| 44530.26696759259 | 9.731 |
| 44530.26766203703 | 9.731 |
| 44530.26835648148 | 9.731 |
| 44530.26905092593 | 9.731 |
| 44530.269745370366 | 9.731 |
| 44530.27043981481 | 9.706 |
| 44530.27113425926 | 9.731 |
| 44530.2718287037 | 9.731 |
| 44530.272523148145 | 9.706 |
| 44530.27321759259 | 9.706 |
| 44530.27391203703 | 9.706 |
| 44530.27460648148 | 9.706 |
| 44530.275300925925 | 9.706 |
| 44530.275995370364 | 9.706 |
| 44530.27668981481 | 9.706 |
| 44530.27738425926 | 9.706 |
| 44530.278078703705 | 9.706 |
| 44530.278773148144 | 9.706 |
| 44530.27946759259 | 9.706 |
| 44530.28016203704 | 9.706 |
| 44530.28085648148 | 9.706 |
| 44530.28155092592 | 9.706 |
| 44530.28224537037 | 9.706 |
| 44530.28293981481 | 9.731 |
| 44530.283634259256 | 9.706 |
| 44530.2843287037 | 9.682 |
| 44530.28502314814 | 9.706 |
| 44530.28571759259 | 9.682 |
| 44530.286412037036 | 9.706 |
| 44530.28710648148 | 9.706 |
| 44530.28780092592 | 9.706 |
| 44530.28849537037 | 9.706 |
| 44530.289189814815 | 9.706 |
| 44530.289884259255 | 9.706 |
| 44530.2905787037 | 9.706 |
| 44530.29127314815 | 9.682 |
| 44530.29196759259 | 9.682 |
| 44530.292662037034 | 9.682 |
| 44530.293356481474 | 9.706 |
| 44530.29405092592 | 9.682 |
| 44530.29474537037 | 9.682 |
| 44530.29543981481 | 9.706 |
| 44530.29613425925 | 9.706 |
| 44530.2968287037 | 9.731 |
| 44530.29752314815 | 9.706 |
| 44530.298217592586 | 9.706 |
| 44530.29891203703 | 9.706 |
| 44530.29960648148 | 9.706 |
| 44530.30030092592 | 9.682 |
| 44530.300995370366 | 9.706 |
| 44530.30168981481 | 9.706 |
| 44530.30238425925 | 9.706 |
| 44530.3030787037 | 9.706 |
| 44530.303773148145 | 9.706 |
| 44530.304467592585 | 9.706 |
| 44530.30516203703 | 9.731 |
| 44530.30585648148 | 9.706 |
| 44530.30655092592 | 9.706 |
| 44530.307245370364 | 9.731 |
| 44530.30793981481 | 9.731 |
| 44530.30863425926 | 9.731 |
| 44530.3093287037 | 9.731 |
| 44530.310023148144 | 9.731 |
| 44530.31071759259 | 9.731 |
| 44530.31141203703 | 9.731 |
| 44530.31210648148 | 9.731 |
| 44530.31280092592 | 9.731 |
| 44530.31349537036 | 9.731 |
| 44530.31418981481 | 9.731 |
| 44530.314884259256 | 9.731 |
| 44530.315578703696 | 9.731 |
| 44530.31627314814 | 9.731 |
| 44530.31696759259 | 9.731 |
| 44530.31766203703 | 9.731 |
| 44530.318356481475 | 9.731 |
| 44530.31905092592 | 9.731 |
| 44530.31974537037 | 9.756 |
| 44530.32043981481 | 9.731 |
| 44530.321134259255 | 9.731 |
| 44530.3218287037 | 9.731 |
| 44530.32252314814 | 9.731 |
| 44530.32321759259 | 9.731 |
| 44530.323912037034 | 9.731 |
| 44530.324606481474 | 9.706 |
| 44530.32530092592 | 9.731 |
| 44530.32599537037 | 9.731 |
| 44530.32668981481 | 9.706 |
| 44530.32738425925 | 9.731 |
| 44530.3280787037 | 9.731 |
| 44530.32877314815 | 9.731 |
| 44530.329467592586 | 9.706 |
| 44530.33016203703 | 9.731 |
| 44530.33085648148 | 9.731 |
| 44530.33155092592 | 9.731 |
| 44530.332245370366 | 9.731 |
| 44530.33293981481 | 9.706 |
| 44530.33363425926 | 9.731 |
| 44530.334328703706 | 9.706 |
| 44530.335023148145 | 9.706 |
| 44530.33571759259 | 9.731 |
| 44530.33641203704 | 9.731 |
| 44530.33710648148 | 9.731 |
| 44530.337800925925 | 9.706 |
| 44530.33849537037 | 9.731 |
| 44530.33918981482 | 9.706 |
| 44530.33988425926 | 9.706 |
| 44530.340578703705 | 9.706 |
| 44530.34127314815 | 9.706 |
| 44530.34196759259 | 9.706 |
| 44530.34266203704 | 9.706 |
| 44530.343356481484 | 9.706 |
| 44530.34405092592 | 9.706 |
| 44530.34474537037 | 9.706 |
| 44530.34543981482 | 9.706 |
| 44530.346134259256 | 9.706 |
| 44530.3468287037 | 9.706 |
| 44530.34752314815 | 9.706 |
| 44530.34821759259 | 9.706 |
| 44530.348912037036 | 9.706 |
| 44530.34960648148 | 9.706 |
| 44530.35030092593 | 9.682 |
| 44530.35099537037 | 9.706 |
| 44530.351689814815 | 9.706 |
| 44530.35238425926 | 9.706 |
| 44530.3530787037 | 9.706 |
| 44530.35377314815 | 9.706 |
| 44530.354467592595 | 9.706 |
| 44530.355162037034 | 9.706 |
| 44530.35585648148 | 9.706 |
| 44530.35655092593 | 9.706 |
| 44530.35724537037 | 9.706 |
| 44530.357939814814 | 9.706 |
| 44530.35863425926 | 9.706 |
| 44530.3593287037 | 9.706 |
| 44530.36002314815 | 9.706 |
| 44530.36071759259 | 9.731 |
| 44530.36141203704 | 9.706 |
| 44530.36210648148 | 9.706 |
| 44530.36280092593 | 9.706 |
| 44530.36349537037 | 9.706 |
| 44530.36418981481 | 9.706 |
| 44530.36488425926 | 9.706 |
| 44530.365578703706 | 9.706 |
| 44530.366273148145 | 9.682 |
| 44530.36696759259 | 9.706 |
| 44530.36766203704 | 9.706 |
| 44530.36835648148 | 9.706 |
| 44530.369050925925 | 9.706 |
| 44530.36974537037 | 9.706 |
| 44530.37043981482 | 9.706 |
| 44530.37113425926 | 9.706 |
| 44530.371828703705 | 9.706 |
| 44530.37252314815 | 9.706 |
| 44530.37321759259 | 9.706 |
| 44530.37391203704 | 9.706 |
| 44530.374606481484 | 9.706 |
| 44530.37530092592 | 9.706 |
| 44530.37599537037 | 9.706 |
| 44530.37668981481 | 9.706 |
| 44530.377384259256 | 9.731 |
| 44530.3780787037 | 9.706 |
| 44530.37877314814 | 9.706 |
| 44530.37946759259 | 9.731 |
| 44530.380162037036 | 9.731 |
| 44530.38085648148 | 9.731 |
| 44530.38155092592 | 9.731 |
| 44530.38224537037 | 9.731 |
| 44530.382939814815 | 9.731 |
| 44530.383634259255 | 9.731 |
| 44530.3843287037 | 9.731 |
| 44530.38502314815 | 9.706 |
| 44530.38571759259 | 9.731 |
| 44530.386412037034 | 9.731 |
| 44530.38710648148 | 9.706 |
| 44530.38780092592 | 9.731 |
| 44530.38849537037 | 9.706 |
| 44530.389189814814 | 9.706 |
| 44530.38988425925 | 9.706 |
| 44530.3905787037 | 9.731 |
| 44530.39127314815 | 9.731 |
| 44530.39196759259 | 9.706 |
| 44530.39266203703 | 9.731 |
| 44530.39335648148 | 9.706 |
| 44530.39405092593 | 9.731 |
| 44530.394745370366 | 9.706 |
| 44530.39543981481 | 9.731 |
| 44530.39613425926 | 9.731 |
| 44530.3968287037 | 9.731 |
| 44530.397523148145 | 9.731 |
| 44530.39821759259 | 9.731 |
| 44530.39891203703 | 9.731 |
| 44530.39960648148 | 9.731 |
| 44530.400300925925 | 9.706 |
| 44530.400995370364 | 9.731 |
| 44530.40168981481 | 9.731 |
| 44530.40238425926 | 9.731 |
| 44530.403078703705 | 9.706 |
| 44530.403773148144 | 9.706 |
| 44530.40446759259 | 9.706 |
| 44530.40516203704 | 9.706 |
| 44530.40585648148 | 9.706 |
| 44530.40655092592 | 9.706 |
| 44530.40724537037 | 9.731 |
| 44530.40793981481 | 9.706 |
| 44530.408634259256 | 9.706 |
| 44530.4093287037 | 9.706 |
| 44530.41002314814 | 9.706 |
| 44530.41071759259 | 9.706 |
| 44530.411412037036 | 9.706 |
| 44530.41210648148 | 9.706 |
| 44530.41280092592 | 9.682 |
| 44530.41349537037 | 9.706 |
| 44530.414189814815 | 9.706 |
| 44530.414884259255 | 9.706 |
| 44530.4155787037 | 9.706 |
| 44530.41627314815 | 9.706 |
| 44530.41696759259 | 9.706 |
| 44530.417662037034 | 9.706 |
| 44530.418356481474 | 9.706 |
| 44530.41905092592 | 9.706 |
| 44530.41974537037 | 9.706 |
| 44530.42043981481 | 9.706 |
| 44530.42113425925 | 9.706 |
| 44530.4218287037 | 9.706 |
| 44530.42252314815 | 9.706 |
| 44530.423217592586 | 9.706 |
| 44530.42391203703 | 9.706 |
| 44530.42460648148 | 9.706 |
| 44530.42530092592 | 9.731 |
| 44530.425995370366 | 9.706 |
| 44530.42668981481 | 9.706 |
| 44530.42738425925 | 9.706 |
| 44530.4280787037 | 9.706 |
| 44530.428773148145 | 9.682 |
| 44530.429467592585 | 9.706 |
| 44530.43016203703 | 9.706 |
| 44530.43085648148 | 9.706 |
| 44530.43155092592 | 9.706 |
| 44530.432245370364 | 9.706 |
| 44530.43293981481 | 9.706 |
| 44530.43363425926 | 9.706 |
| 44530.4343287037 | 9.682 |
| 44530.435023148144 | 9.706 |
| 44530.43571759259 | 9.706 |
| 44530.43641203703 | 9.706 |
| 44530.43710648148 | 9.706 |
| 44530.43780092592 | 9.706 |
| 44530.43849537036 | 9.706 |
| 44530.43918981481 | 9.706 |
| 44530.439884259256 | 9.706 |
| 44530.440578703696 | 9.706 |
| 44530.44127314814 | 9.706 |
| 44530.44196759259 | 9.706 |
| 44530.44266203703 | 9.706 |
| 44530.443356481475 | 9.682 |
| 44530.44405092592 | 9.706 |
| 44530.44474537037 | 9.706 |
| 44530.44543981481 | 9.706 |
| 44530.446134259255 | 9.706 |
| 44530.4468287037 | 9.706 |
| 44530.44752314814 | 9.706 |
| 44530.44821759259 | 9.706 |
| 44530.448912037034 | 9.706 |
| 44530.449606481474 | 9.706 |
| 44530.45030092592 | 9.706 |
| 44530.45099537037 | 9.706 |
| 44530.45168981481 | 9.706 |
| 44530.45238425925 | 9.731 |
| 44530.4530787037 | 9.706 |
| 44530.45377314815 | 9.706 |
| 44530.454467592586 | 9.706 |
| 44530.45516203703 | 9.731 |
| 44530.45585648148 | 9.706 |
| 44530.45655092592 | 9.706 |
| 44530.457245370366 | 9.706 |
| 44530.45793981481 | 9.706 |
| 44530.45863425926 | 9.706 |
| 44530.459328703706 | 9.706 |
| 44530.460023148145 | 9.706 |
| 44530.46071759259 | 9.706 |
| 44530.46141203704 | 9.731 |
| 44530.46210648148 | 9.706 |
| 44530.462800925925 | 9.706 |
| 44530.46349537037 | 9.706 |
| 44530.46418981482 | 9.706 |
| 44530.46488425926 | 9.706 |
| 44530.465578703705 | 9.706 |
| 44530.46627314815 | 9.706 |
| 44530.46696759259 | 9.706 |
| 44530.46766203704 | 9.706 |
| 44530.468356481484 | 9.706 |
| 44530.46905092592 | 9.706 |
| 44530.46974537037 | 9.706 |
| 44530.47043981482 | 9.706 |
| 44530.471134259256 | 9.706 |
| 44530.4718287037 | 9.706 |
| 44530.47252314815 | 9.706 |
| 44530.47321759259 | 9.706 |
| 44530.473912037036 | 9.706 |
| 44530.47460648148 | 9.706 |
| 44530.47530092593 | 9.706 |
| 44530.47599537037 | 9.731 |
| 44530.476689814815 | 9.706 |
| 44530.47738425926 | 9.706 |
| 44530.4780787037 | 9.706 |
| 44530.47877314815 | 9.706 |
| 44530.479467592595 | 9.706 |
| 44530.480162037034 | 9.706 |
| 44530.48085648148 | 9.706 |
| 44530.48155092593 | 9.706 |
| 44530.48224537037 | 9.706 |
| 44530.482939814814 | 9.706 |
| 44530.48363425926 | 9.706 |
| 44530.4843287037 | 9.731 |
| 44530.48502314815 | 9.706 |
| 44530.48571759259 | 9.706 |
| 44530.48641203704 | 9.706 |
| 44530.48710648148 | 9.731 |
| 44530.48780092593 | 9.706 |
| 44530.48849537037 | 9.706 |
| 44530.48918981481 | 9.706 |
| 44530.48988425926 | 9.706 |
| 44530.490578703706 | 9.731 |
| 44530.491273148145 | 9.706 |
| 44530.49196759259 | 9.706 |
| 44530.49266203704 | 9.706 |
| 44530.49335648148 | 9.706 |
| 44530.494050925925 | 9.706 |
| 44530.49474537037 | 9.706 |
| 44530.49543981482 | 9.731 |
| 44530.49613425926 | 9.731 |
| 44530.496828703705 | 9.706 |
| 44530.49752314815 | 9.706 |
| 44530.49821759259 | 9.706 |
| 44530.49891203704 | 9.706 |
| 44530.499606481484 | 9.706 |
| 44530.50030092592 | 9.731 |
| 44530.50099537037 | 9.706 |
| 44530.50168981481 | 9.706 |
| 44530.502384259256 | 9.731 |
| 44530.5030787037 | 9.706 |
| 44530.50377314814 | 9.731 |
| 44530.50446759259 | 9.731 |
| 44530.505162037036 | 9.731 |
| 44530.50585648148 | 9.706 |